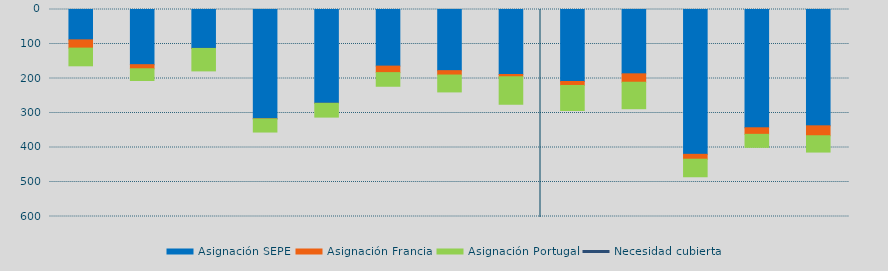
| Category | Asignación SEPE | Asignación Francia | Asignación Portugal |
|---|---|---|---|
| 0 | 88000.9 | 23926.8 | 51284.5 |
| 1 | 159946.5 | 11873.6 | 33973.4 |
| 2 | 112774.35 | 263.2 | 64888 |
| 3 | 316845.45 | 348.4 | 37996.4 |
| 4 | 271981.65 | 130 | 39763.3 |
| 5 | 164113.775 | 18818.7 | 39543.6 |
| 6 | 177218.25 | 12730.4 | 48945.8 |
| 7 | 188386.325 | 6515.6 | 79746.7 |
| 8 | 208745.675 | 11423.2 | 72605.3 |
| 9 | 186451.1 | 24373.9 | 76706.4 |
| 10 | 419821.425 | 14091.1 | 50867.1 |
| 11 | 342830.4 | 19044.4 | 37683.7 |
| 12 | 337163.825 | 28792 | 47265.2 |